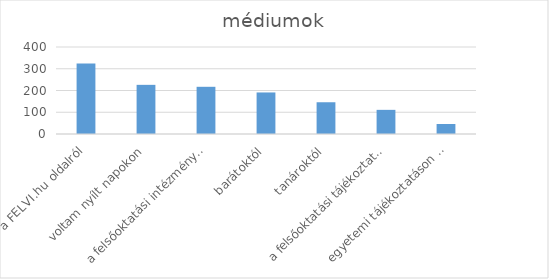
| Category | Series 0 |
|---|---|
| a FELVI.hu oldalról | 324 |
| voltam nyílt napokon | 226 |
| a felsőoktatási intézmények honlapjait böngésztem | 217 |
| barátoktól | 191 |
| tanároktól | 146 |
| a felsőoktatási tájékoztatóból | 111 |
| egyetemi tájékoztatáson road-show keretében | 46 |